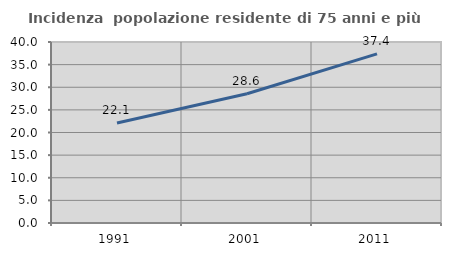
| Category | Incidenza  popolazione residente di 75 anni e più |
|---|---|
| 1991.0 | 22.105 |
| 2001.0 | 28.571 |
| 2011.0 | 37.383 |